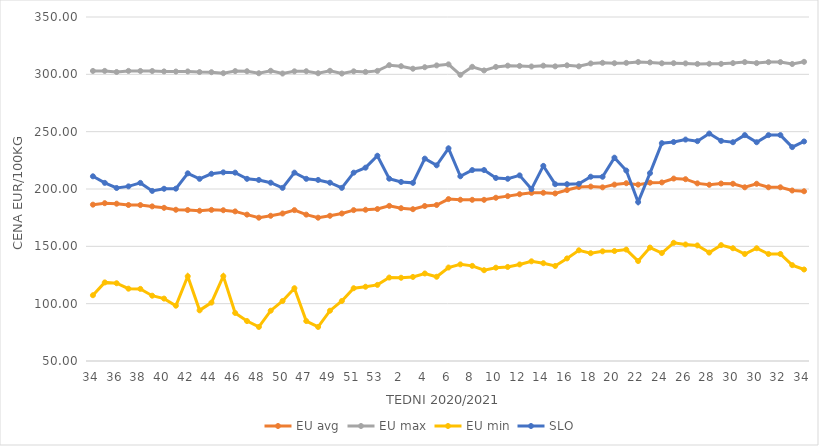
| Category | EU avg | EU max | EU min | SLO |
|---|---|---|---|---|
| 34.0 | 186.338 | 302.96 | 107.355 | 211.07 |
| 35.0 | 187.628 | 302.99 | 118.534 | 205.34 |
| 36.0 | 187.19 | 302.05 | 117.814 | 200.88 |
| 37.0 | 186.038 | 302.98 | 113.058 | 202.29 |
| 38.0 | 185.986 | 302.94 | 112.896 | 205.33 |
| 39.0 | 184.836 | 302.88 | 106.953 | 198.33 |
| 40.0 | 183.595 | 302.56 | 104.426 | 200.21 |
| 41.0 | 181.893 | 302.44 | 98.23 | 200.3 |
| 42.0 | 181.671 | 302.52 | 123.908 | 213.66 |
| 43.0 | 181.023 | 302.01 | 94.177 | 208.86 |
| 44.0 | 181.795 | 301.86 | 100.908 | 213.25 |
| 45.0 | 181.489 | 300.98 | 124 | 214.51 |
| 46.0 | 180.473 | 302.82 | 91.889 | 214.27 |
| 47.0 | 177.656 | 302.7 | 84.832 | 208.87 |
| 48.0 | 174.977 | 300.94 | 79.697 | 207.9 |
| 49.0 | 176.65 | 303.09 | 93.873 | 205.48 |
| 50.0 | 178.648 | 300.7 | 102.316 | 200.99 |
| 51.0 | 181.58 | 302.62 | 113.46 | 214.25 |
| 47.0 | 177.656 | 302.7 | 84.832 | 208.87 |
| 48.0 | 174.977 | 300.94 | 79.697 | 207.9 |
| 49.0 | 176.65 | 303.09 | 93.873 | 205.48 |
| 50.0 | 178.648 | 300.7 | 102.316 | 200.99 |
| 51.0 | 181.58 | 302.62 | 113.46 | 214.25 |
| 52.0 | 181.9 | 302.14 | 114.76 | 218.61 |
| 53.0 | 182.536 | 303 | 116.375 | 229 |
| 1.0 | 185.3 | 308 | 122.769 | 209 |
| 2.0 | 183.25 | 307.1 | 122.609 | 206.15 |
| 3.0 | 182.393 | 304.91 | 123.32 | 205.35 |
| 4.0 | 185.158 | 306.22 | 126.329 | 226.48 |
| 5.0 | 186.04 | 307.79 | 123.461 | 220.65 |
| 6.0 | 191.206 | 308.7 | 131.528 | 235.46 |
| 7.0 | 190.629 | 299.55 | 134.262 | 211.1 |
| 8.0 | 190.57 | 306.55 | 132.97 | 216.51 |
| 9.0 | 190.562 | 303.4 | 129.173 | 216.54 |
| 10.0 | 192.373 | 306.48 | 131.374 | 209.61 |
| 11.0 | 193.79 | 307.58 | 132.024 | 208.91 |
| 12.0 | 195.449 | 307.33 | 134.212 | 211.87 |
| 13.0 | 196.631 | 306.85 | 136.936 | 199.93 |
| 14.0 | 196.702 | 307.56 | 135.297 | 220.15 |
| 15.0 | 196.13 | 306.96 | 132.893 | 204.2 |
| 16.0 | 199.1 | 307.87 | 139.462 | 204.2 |
| 17.0 | 201.754 | 306.98 | 146.538 | 204.51 |
| 18.0 | 202.13 | 309.49 | 144.017 | 210.72 |
| 19.0 | 201.439 | 310.06 | 145.644 | 210.68 |
| 20.0 | 203.834 | 309.69 | 145.911 | 227.32 |
| 21.0 | 205.04 | 309.99 | 147.188 | 216.08 |
| 22.0 | 203.79 | 310.76 | 137.177 | 188.6 |
| 23.0 | 205.51 | 310.41 | 148.928 | 213.84 |
| 24.0 | 205.73 | 309.64 | 144.161 | 239.99 |
| 25.0 | 209.095 | 309.74 | 153.081 | 240.99 |
| 26.0 | 208.551 | 309.55 | 151.599 | 243.11 |
| 27.0 | 204.914 | 309.08 | 150.789 | 241.72 |
| 28.0 | 203.681 | 309.21 | 144.56 | 248.33 |
| 29.0 | 204.773 | 309.15 | 151.052 | 241.96 |
| 30.0 | 204.558 | 309.78 | 148.33 | 240.79 |
| 31.0 | 201.483 | 310.67 | 143.33 | 247 |
| 30.0 | 204.558 | 309.78 | 148.33 | 240.79 |
| 31.0 | 201.483 | 310.67 | 143.33 | 247 |
| 32.0 | 201.483 | 310.67 | 143.33 | 247 |
| 33.0 | 198.691 | 309 | 133.607 | 236.54 |
| 34.0 | 198.027 | 310.9 | 129.797 | 241.45 |